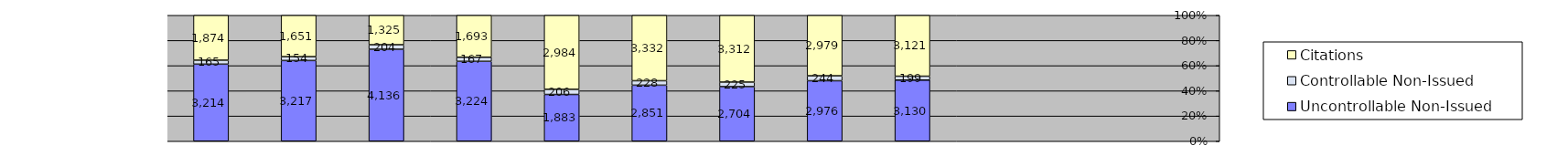
| Category | Uncontrollable Non-Issued | Controllable Non-Issued | Citations |
|---|---|---|---|
| 0 | 3214 | 165 | 1874 |
| 1900-01-01 | 3217 | 154 | 1651 |
| 1900-01-02 | 4136 | 204 | 1325 |
| 1900-01-03 | 3224 | 167 | 1693 |
| 1900-01-04 | 1883 | 206 | 2984 |
| 1900-01-05 | 2851 | 228 | 3332 |
| 1900-01-06 | 2704 | 225 | 3312 |
| 1900-01-07 | 2976 | 244 | 2979 |
| 1900-01-08 | 3130 | 199 | 3121 |
| 1900-01-09 | 0 | 0 | 0 |
| 1900-01-10 | 0 | 0 | 0 |
| 1900-01-11 | 0 | 0 | 0 |